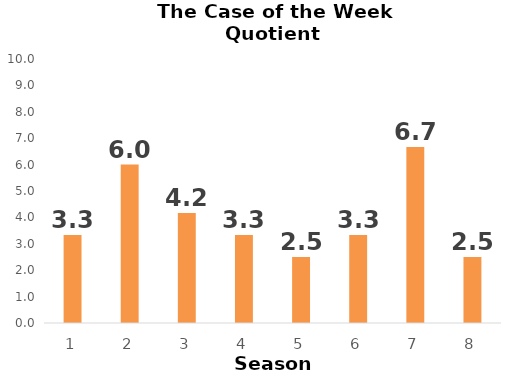
| Category | Dexter |
|---|---|
| 0 | 3.333 |
| 1 | 6 |
| 2 | 4.167 |
| 3 | 3.333 |
| 4 | 2.5 |
| 5 | 3.333 |
| 6 | 6.667 |
| 7 | 2.5 |